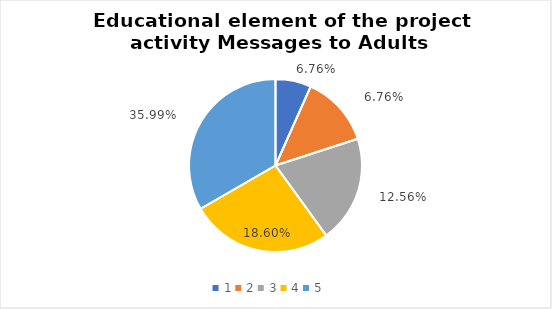
| Category | Series 0 | Series 1 |
|---|---|---|
| 0 | 1 | 0.068 |
| 1 | 2 | 0.068 |
| 2 | 3 | 0.126 |
| 3 | 4 | 0.186 |
| 4 | 5 | 0.36 |